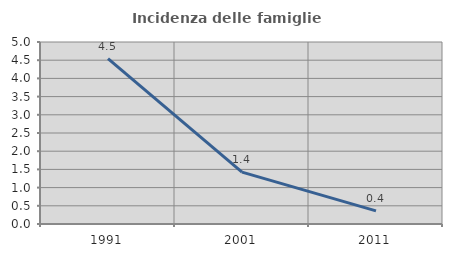
| Category | Incidenza delle famiglie numerose |
|---|---|
| 1991.0 | 4.545 |
| 2001.0 | 1.426 |
| 2011.0 | 0.36 |